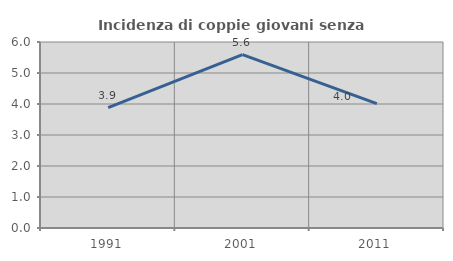
| Category | Incidenza di coppie giovani senza figli |
|---|---|
| 1991.0 | 3.881 |
| 2001.0 | 5.59 |
| 2011.0 | 4.012 |